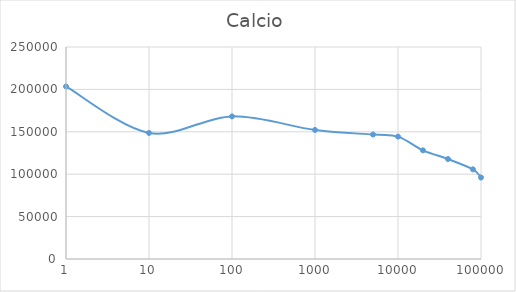
| Category | Calcio |
|---|---|
| 1.0 | 203454.674 |
| 10.0 | 148654 |
| 100.0 | 168178.055 |
| 1000.0 | 152157.253 |
| 5000.0 | 146766.081 |
| 10000.0 | 144313.768 |
| 20000.0 | 128108.348 |
| 40000.0 | 117897.194 |
| 80000.0 | 105728.134 |
| 100000.0 | 96086.186 |